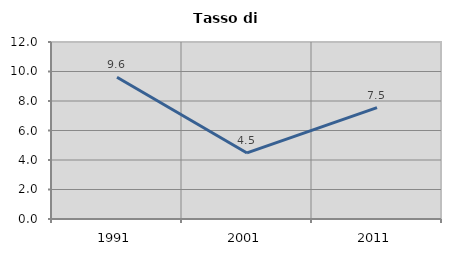
| Category | Tasso di disoccupazione   |
|---|---|
| 1991.0 | 9.607 |
| 2001.0 | 4.478 |
| 2011.0 | 7.547 |